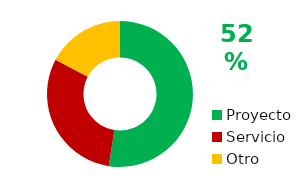
| Category | Dedicación |
|---|---|
| Proyecto | 64 |
| Servicio | 37 |
| Otro | 21 |